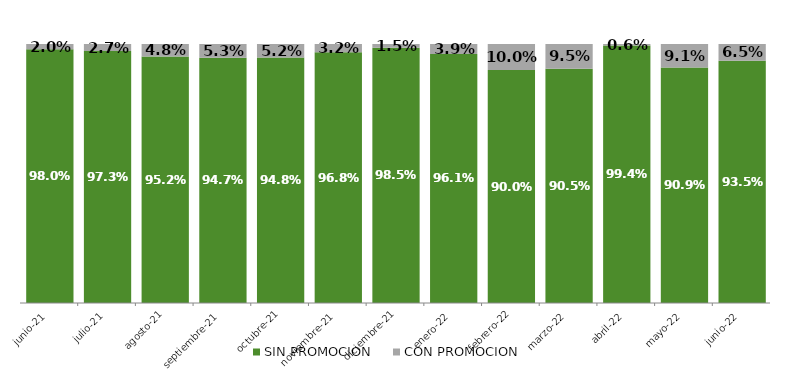
| Category | SIN PROMOCION   | CON PROMOCION   |
|---|---|---|
| 2021-06-01 | 0.98 | 0.02 |
| 2021-07-01 | 0.973 | 0.027 |
| 2021-08-01 | 0.952 | 0.048 |
| 2021-09-01 | 0.947 | 0.053 |
| 2021-10-01 | 0.948 | 0.052 |
| 2021-11-01 | 0.968 | 0.032 |
| 2021-12-01 | 0.985 | 0.015 |
| 2022-01-01 | 0.961 | 0.039 |
| 2022-02-01 | 0.9 | 0.1 |
| 2022-03-01 | 0.905 | 0.095 |
| 2022-04-01 | 0.994 | 0.006 |
| 2022-05-01 | 0.909 | 0.091 |
| 2022-06-01 | 0.935 | 0.065 |